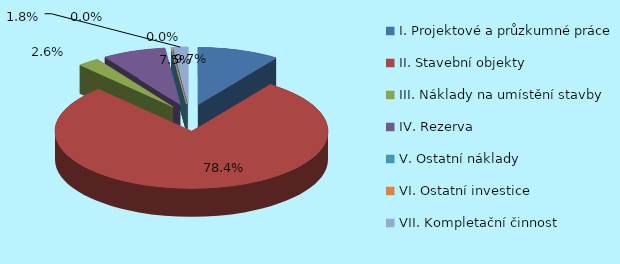
| Category | Series 0 | Series 1 |
|---|---|---|
| 0 | 234454.128 |  |
| 1 | 1890628.921 |  |
| 2 | 62390.754 |  |
| 3 | 181500.376 |  |
| 4 | 0 |  |
| 5 | 0 |  |
| 6 | 43484.465 |  |